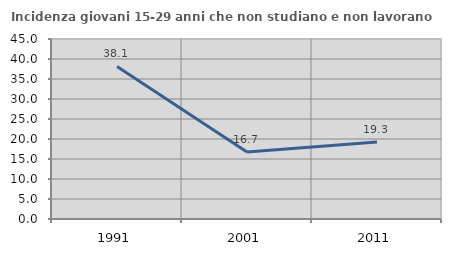
| Category | Incidenza giovani 15-29 anni che non studiano e non lavorano  |
|---|---|
| 1991.0 | 38.14 |
| 2001.0 | 16.728 |
| 2011.0 | 19.252 |